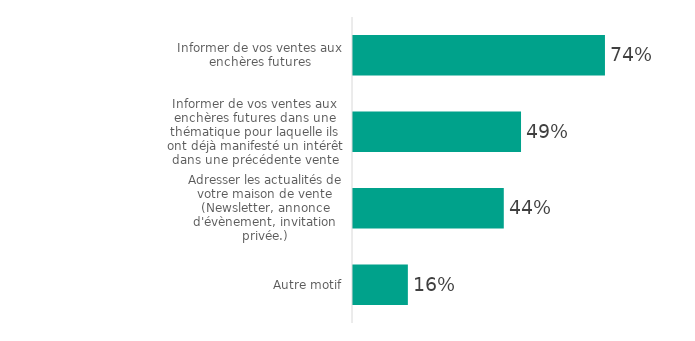
| Category | Series 0 |
|---|---|
| Informer de vos ventes aux enchères futures | 73.887 |
| Informer de vos ventes aux enchères futures dans une thématique pour laquelle ils ont déjà manifesté un intérêt dans une précédente vente | 49.274 |
| Adresser les actualités de votre maison de vente (Newsletter, annonce d'évènement, invitation privée.) | 44.218 |
| Autre motif | 16.088 |